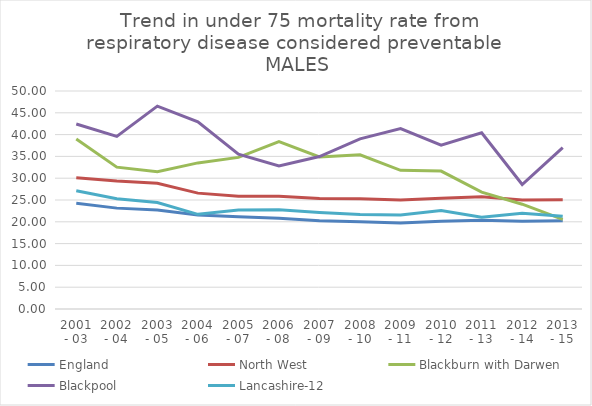
| Category | England | North West | Blackburn with Darwen | Blackpool | Lancashire-12 |
|---|---|---|---|---|---|
| 2001 - 03 | 24.237 | 30.108 | 38.983 | 42.433 | 27.118 |
| 2002 - 04 | 23.136 | 29.341 | 32.541 | 39.59 | 25.265 |
| 2003 - 05 | 22.705 | 28.818 | 31.496 | 46.531 | 24.433 |
| 2004 - 06 | 21.56 | 26.577 | 33.508 | 42.931 | 21.715 |
| 2005 - 07 | 21.183 | 25.873 | 34.772 | 35.53 | 22.692 |
| 2006 - 08 | 20.828 | 25.857 | 38.391 | 32.788 | 22.787 |
| 2007 - 09 | 20.253 | 25.334 | 34.871 | 34.971 | 22.141 |
| 2008 - 10 | 19.99 | 25.29 | 35.364 | 39.019 | 21.676 |
| 2009 - 11 | 19.732 | 25.027 | 31.806 | 41.383 | 21.54 |
| 2010 - 12 | 20.128 | 25.391 | 31.635 | 37.57 | 22.573 |
| 2011 - 13 | 20.354 | 25.742 | 26.813 | 40.422 | 21.065 |
| 2012 - 14 | 20.135 | 25.002 | 24.038 | 28.548 | 21.956 |
| 2013 - 15 | 20.256 | 25.036 | 20.573 | 36.99 | 21.28 |